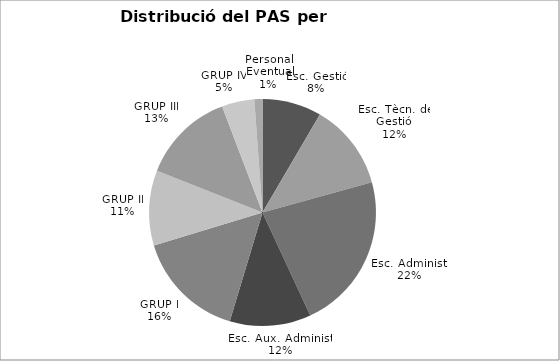
| Category | Series 0 |
|---|---|
| Esc. Gestió | 124 |
| Esc. Tècn. de Gestió | 180 |
| Esc. Administ. | 329 |
| Esc. Aux. Administ. | 170 |
| GRUP I | 230 |
| GRUP II | 157 |
| GRUP III | 194 |
| GRUP IV | 68 |
| Personal Eventual | 17 |